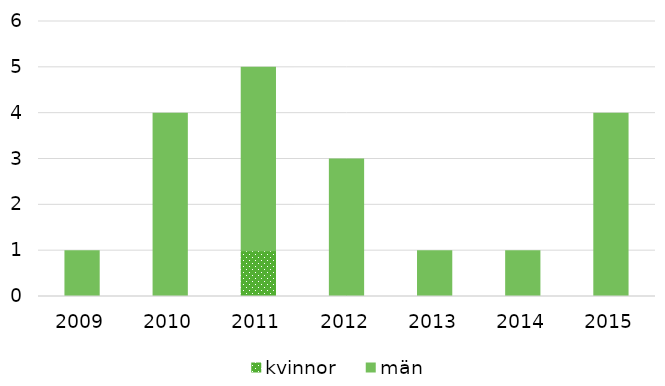
| Category | kvinnor | män |
|---|---|---|
| 2009.0 | 0 | 1 |
| 2010.0 | 0 | 4 |
| 2011.0 | 1 | 4 |
| 2012.0 | 0 | 3 |
| 2013.0 | 0 | 1 |
| 2014.0 | 0 | 1 |
| 2015.0 | 0 | 4 |